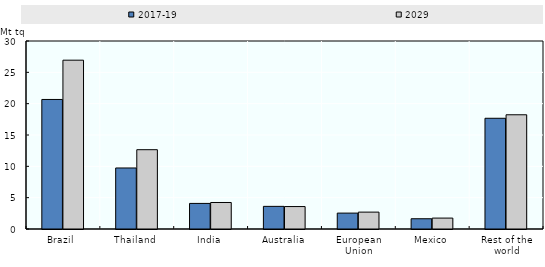
| Category | 2017-19 | 2029 |
|---|---|---|
| Brazil | 20.672 | 26.94 |
| Thailand | 9.737 | 12.656 |
| India | 4.082 | 4.23 |
| Australia | 3.612 | 3.583 |
| European Union | 2.537 | 2.695 |
| Mexico | 1.638 | 1.743 |
| Rest of the world | 17.669 | 18.228 |